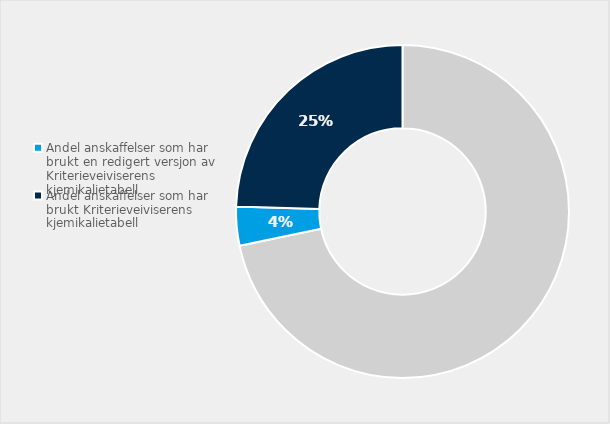
| Category | Andel |
|---|---|
| Andel som ikke har den inkludert | 0.717 |
| Andel anskaffelser som har brukt en redigert versjon av Kriterieveiviserens kjemikalietabell | 0.038 |
| Andel anskaffelser som har brukt Kriterieveiviserens kjemikalietabell | 0.245 |